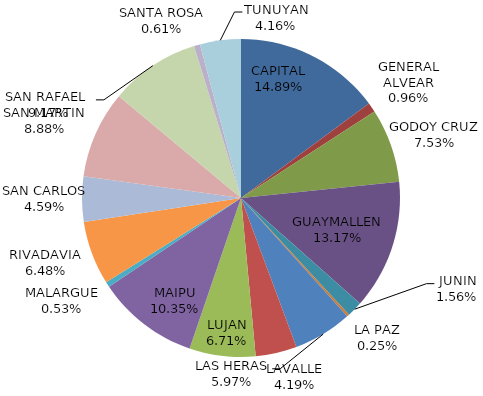
| Category | Total Otros Juegos Propios Recaudación  |
|---|---|
| CAPITAL | 595995 |
| GENERAL ALVEAR | 38500 |
| GODOY CRUZ | 301575 |
| GUAYMALLEN | 527240 |
| JUNIN | 62565 |
| LA PAZ | 10105 |
| LAS HERAS | 239190 |
| LAVALLE | 167775 |
| LUJAN | 268760 |
| MAIPU | 414215 |
| MALARGUE | 21335 |
| RIVADAVIA | 259465 |
| SAN CARLOS | 183865 |
| SAN MARTIN | 355430 |
| SAN RAFAEL  | 366930 |
| SANTA ROSA | 24560 |
| TUNUYAN | 166405 |